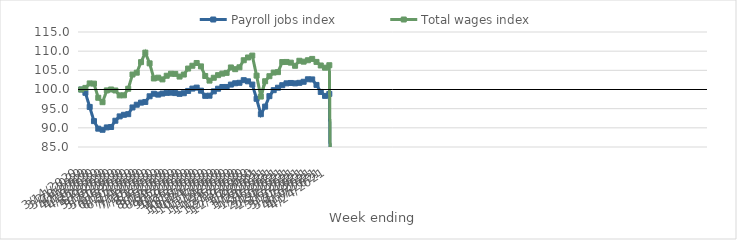
| Category | Payroll jobs index | Total wages index |
|---|---|---|
| 14/03/2020 | 100 | 100 |
| 21/03/2020 | 99.138 | 100.416 |
| 28/03/2020 | 95.455 | 101.589 |
| 04/04/2020 | 91.75 | 101.534 |
| 11/04/2020 | 89.785 | 97.842 |
| 18/04/2020 | 89.493 | 96.692 |
| 25/04/2020 | 90.109 | 99.763 |
| 02/05/2020 | 90.217 | 100.004 |
| 09/05/2020 | 91.851 | 99.744 |
| 16/05/2020 | 92.985 | 98.463 |
| 23/05/2020 | 93.398 | 98.48 |
| 30/05/2020 | 93.565 | 100.194 |
| 06/06/2020 | 95.316 | 103.905 |
| 13/06/2020 | 96.032 | 104.389 |
| 20/06/2020 | 96.572 | 107.14 |
| 27/06/2020 | 96.75 | 109.622 |
| 04/07/2020 | 98.232 | 106.82 |
| 11/07/2020 | 98.894 | 102.88 |
| 18/07/2020 | 98.666 | 103.085 |
| 25/07/2020 | 98.936 | 102.636 |
| 01/08/2020 | 99.122 | 103.587 |
| 08/08/2020 | 99.173 | 104.116 |
| 15/08/2020 | 99.065 | 104.075 |
| 22/08/2020 | 98.871 | 103.371 |
| 29/08/2020 | 99.029 | 103.897 |
| 05/09/2020 | 99.626 | 105.463 |
| 12/09/2020 | 100.236 | 106.197 |
| 19/09/2020 | 100.497 | 106.914 |
| 26/09/2020 | 99.691 | 106.031 |
| 03/10/2020 | 98.342 | 103.523 |
| 10/10/2020 | 98.384 | 102.318 |
| 17/10/2020 | 99.514 | 103.064 |
| 24/10/2020 | 100.207 | 103.741 |
| 31/10/2020 | 100.655 | 104.137 |
| 07/11/2020 | 100.663 | 104.339 |
| 14/11/2020 | 101.282 | 105.748 |
| 21/11/2020 | 101.626 | 105.3 |
| 28/11/2020 | 101.75 | 105.792 |
| 05/12/2020 | 102.43 | 107.634 |
| 12/12/2020 | 102.135 | 108.353 |
| 19/12/2020 | 101.289 | 108.848 |
| 26/12/2020 | 97.577 | 103.619 |
| 02/01/2021 | 93.556 | 98.156 |
| 09/01/2021 | 95.537 | 102.154 |
| 16/01/2021 | 98.27 | 103.47 |
| 23/01/2021 | 99.823 | 104.422 |
| 30/01/2021 | 100.465 | 104.532 |
| 06/02/2021 | 101.119 | 107.165 |
| 13/02/2021 | 101.608 | 107.19 |
| 20/02/2021 | 101.7 | 107.005 |
| 27/02/2021 | 101.595 | 106.187 |
| 06/03/2021 | 101.74 | 107.493 |
| 13/03/2021 | 102.016 | 107.262 |
| 20/03/2021 | 102.667 | 107.632 |
| 27/03/2021 | 102.633 | 107.978 |
| 03/04/2021 | 101.194 | 107.195 |
| 10/04/2021 | 99.362 | 106.267 |
| 17/04/2021 | 98.336 | 105.693 |
| 24/04/2021 | 98.855 | 106.331 |